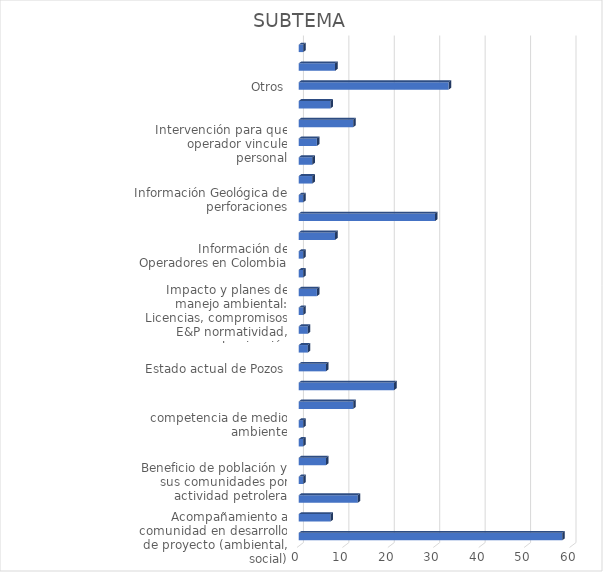
| Category | CANTIDAD |
|---|---|
| Acompañamiento a comunidad en desarrollo de proyecto (ambiental, social) | 58 |
| Actividad Hidrocarburífera en regiones del país | 7 |
| Áreas Asignadas, Áreas libres, reglamentación especial, requisitos y criterios para su asignación | 13 |
| Beneficio de población y sus comunidades por actividad petrolera | 1 |
| Cifras oficiales de producción en el país (producción, precio, demanda, Columnas Estratigráficas | 6 |
| competencia de la agencia nacional de mineria  | 1 |
| competencia de medio ambiente | 1 |
| Congreso de la República y Senado  | 12 |
| Copias de contratos (E&P, TEAS y Administrativos) | 21 |
| Estado actual de Pozos | 6 |
| Estado de contrato de asociación | 2 |
| Fracking  | 2 |
| Impacto y planes de manejo ambiental: Licencias, compromisos E&P normatividad, contaminación | 1 |
| Inconformidad por desarrollo irregular de proyecto | 4 |
| informacion de estudios de sismica | 1 |
| Información de Operadores en Colombia | 1 |
| Información del trámite o proceso para pago de regalías | 8 |
| Información en formato shapefile acerca de las reservas naturales, humedales y comunidades | 30 |
| Información Geológica de perforaciones | 1 |
| Información y aclaración sobre los TEAs, E&P, Bloques | 3 |
| Informes sobres Consultas previas | 3 |
| Intervención para que operador vincule personal | 4 |
| Intervención por no pago a subcontratistas por parte de Operadoras  | 12 |
| Listas de Elegibles | 7 |
| Otros | 33 |
| Reliquidación de regalías | 8 |
| solicitud de copias  | 1 |